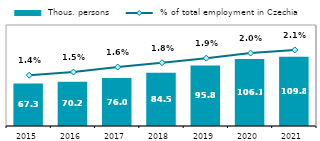
| Category |  Thous. persons |
|---|---|
| 2015.0 | 67.304 |
| 2016.0 | 70.167 |
| 2017.0 | 75.994 |
| 2018.0 | 84.531 |
| 2019.0 | 95.752 |
| 2020.0 | 106.113 |
| 2021.0 | 109.817 |